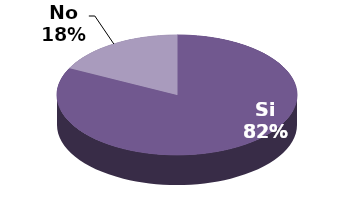
| Category | Series 1 |
|---|---|
| Si | 14 |
| No | 3 |